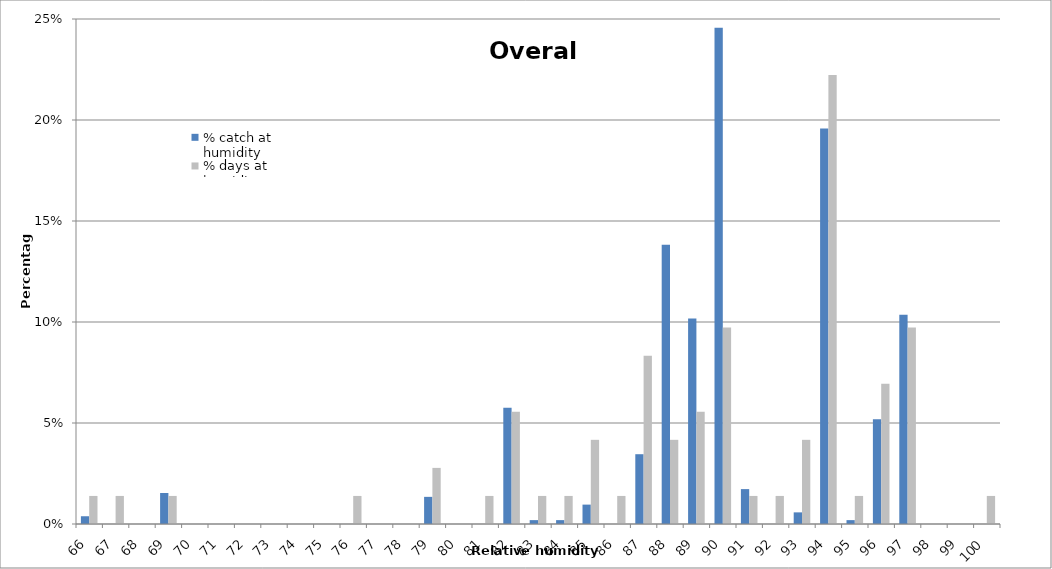
| Category | % catch at humidity | % days at humidity |
|---|---|---|
| 66.0 | 0.004 | 0.014 |
| 67.0 | 0 | 0.014 |
| 68.0 | 0 | 0 |
| 69.0 | 0.015 | 0.014 |
| 70.0 | 0 | 0 |
| 71.0 | 0 | 0 |
| 72.0 | 0 | 0 |
| 73.0 | 0 | 0 |
| 74.0 | 0 | 0 |
| 75.0 | 0 | 0 |
| 76.0 | 0 | 0.014 |
| 77.0 | 0 | 0 |
| 78.0 | 0 | 0 |
| 79.0 | 0.013 | 0.028 |
| 80.0 | 0 | 0 |
| 81.0 | 0 | 0.014 |
| 82.0 | 0.058 | 0.056 |
| 83.0 | 0.002 | 0.014 |
| 84.0 | 0.002 | 0.014 |
| 85.0 | 0.01 | 0.042 |
| 86.0 | 0 | 0.014 |
| 87.0 | 0.035 | 0.083 |
| 88.0 | 0.138 | 0.042 |
| 89.0 | 0.102 | 0.056 |
| 90.0 | 0.246 | 0.097 |
| 91.0 | 0.017 | 0.014 |
| 92.0 | 0 | 0.014 |
| 93.0 | 0.006 | 0.042 |
| 94.0 | 0.196 | 0.222 |
| 95.0 | 0.002 | 0.014 |
| 96.0 | 0.052 | 0.069 |
| 97.0 | 0.104 | 0.097 |
| 98.0 | 0 | 0 |
| 99.0 | 0 | 0 |
| 100.0 | 0 | 0.014 |